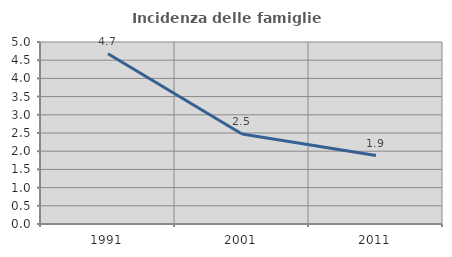
| Category | Incidenza delle famiglie numerose |
|---|---|
| 1991.0 | 4.678 |
| 2001.0 | 2.471 |
| 2011.0 | 1.881 |